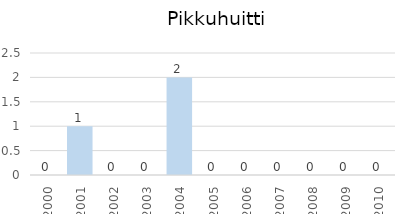
| Category | Series 0 |
|---|---|
| 2000.0 | 0 |
| 2001.0 | 1 |
| 2002.0 | 0 |
| 2003.0 | 0 |
| 2004.0 | 2 |
| 2005.0 | 0 |
| 2006.0 | 0 |
| 2007.0 | 0 |
| 2008.0 | 0 |
| 2009.0 | 0 |
| 2010.0 | 0 |